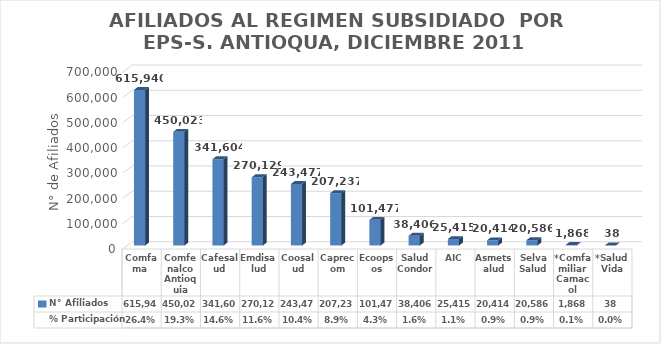
| Category | N° Afiliados | % Participación |
|---|---|---|
| Comfama  | 615940 | 0.264 |
| Comfenalco Antioquia | 450023 | 0.193 |
| Cafesalud | 341604 | 0.146 |
| Emdisalud | 270129 | 0.116 |
| Coosalud | 243477 | 0.104 |
| Caprecom | 207237 | 0.089 |
| Ecoopsos | 101477 | 0.043 |
| Salud Condor | 38406 | 0.016 |
| AIC | 25415 | 0.011 |
| Asmetsalud | 20414 | 0.009 |
| Selva Salud | 20586 | 0.009 |
| *Comfamiliar Camacol | 1868 | 0.001 |
| *SaludVida | 38 | 0 |